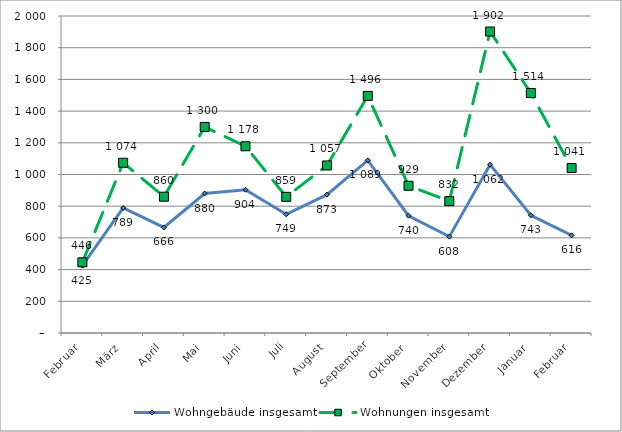
| Category | Wohngebäude insgesamt | Wohnungen insgesamt |
|---|---|---|
| Februar | 425 | 446 |
| März | 789 | 1074 |
| April | 666 | 860 |
| Mai | 880 | 1300 |
| Juni | 904 | 1178 |
| Juli | 749 | 859 |
| August | 873 | 1057 |
| September | 1089 | 1496 |
| Oktober | 740 | 929 |
| November | 608 | 832 |
| Dezember | 1062 | 1902 |
| Januar | 743 | 1514 |
| Februar | 616 | 1041 |